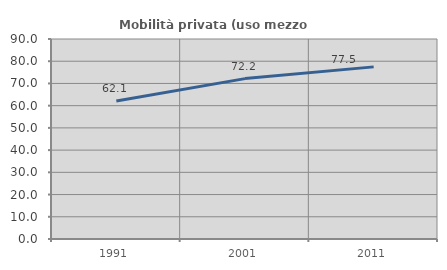
| Category | Mobilità privata (uso mezzo privato) |
|---|---|
| 1991.0 | 62.098 |
| 2001.0 | 72.173 |
| 2011.0 | 77.457 |